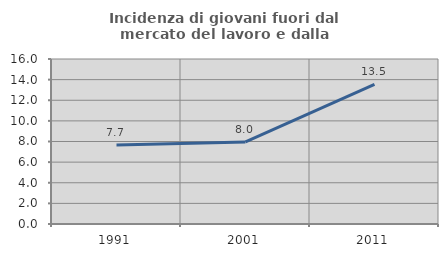
| Category | Incidenza di giovani fuori dal mercato del lavoro e dalla formazione  |
|---|---|
| 1991.0 | 7.661 |
| 2001.0 | 7.953 |
| 2011.0 | 13.546 |